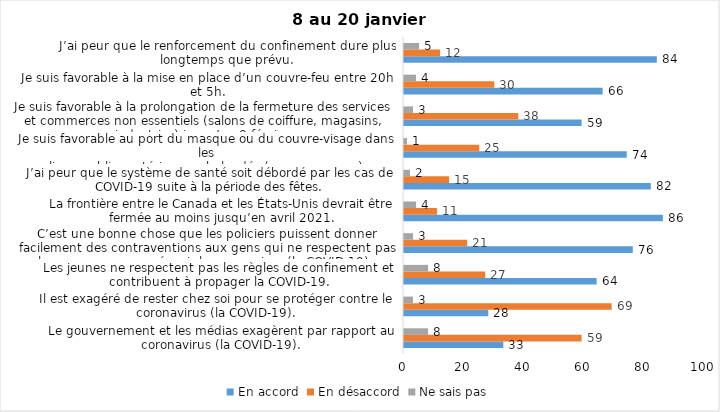
| Category | En accord | En désaccord | Ne sais pas |
|---|---|---|---|
| Le gouvernement et les médias exagèrent par rapport au coronavirus (la COVID-19). | 33 | 59 | 8 |
| Il est exagéré de rester chez soi pour se protéger contre le coronavirus (la COVID-19). | 28 | 69 | 3 |
| Les jeunes ne respectent pas les règles de confinement et contribuent à propager la COVID-19. | 64 | 27 | 8 |
| C’est une bonne chose que les policiers puissent donner facilement des contraventions aux gens qui ne respectent pas les mesures pour prévenir le coronavirus (la COVID-19). | 76 | 21 | 3 |
| La frontière entre le Canada et les États-Unis devrait être fermée au moins jusqu’en avril 2021. | 86 | 11 | 4 |
| J’ai peur que le système de santé soit débordé par les cas de COVID-19 suite à la période des fêtes. | 82 | 15 | 2 |
| Je suis favorable au port du masque ou du couvre-visage dans les
lieux publics extérieurs achalandés (ex. rues, parcs) | 74 | 25 | 1 |
| Je suis favorable à la prolongation de la fermeture des services et commerces non essentiels (salons de coiffure, magasins, industries) jusqu’au 8 février. | 59 | 38 | 3 |
| Je suis favorable à la mise en place d’un couvre-feu entre 20h et 5h. | 66 | 30 | 4 |
| J’ai peur que le renforcement du confinement dure plus longtemps que prévu. | 84 | 12 | 5 |